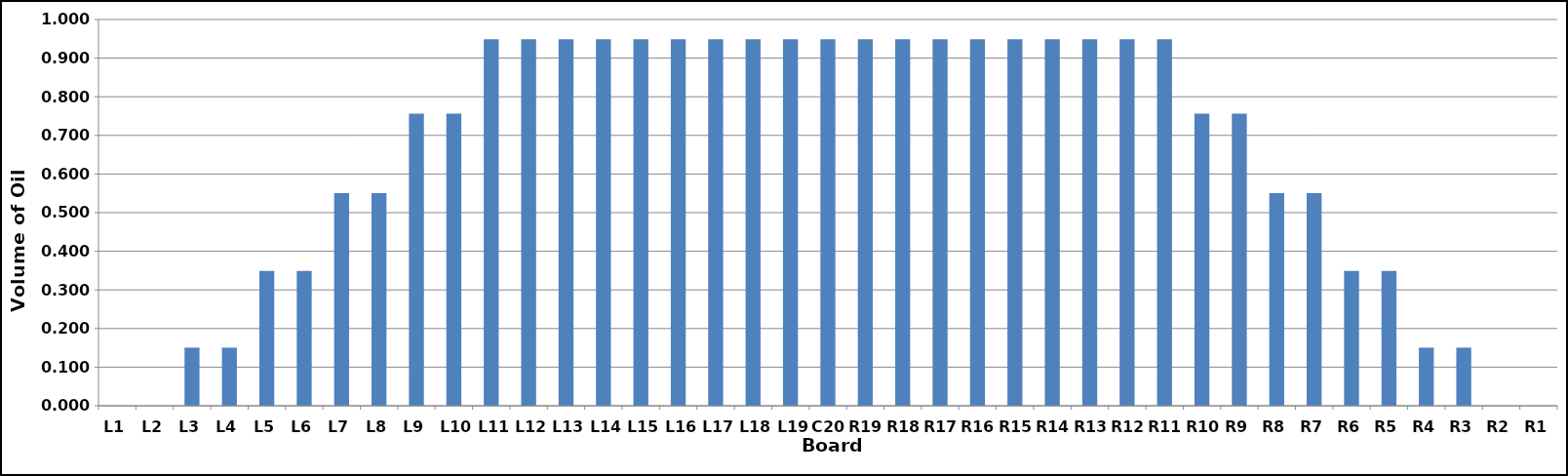
| Category | Series 0 |
|---|---|
| L1 | 0 |
| L2 | 0 |
| L3 | 0.15 |
| L4 | 0.15 |
| L5 | 0.349 |
| L6 | 0.349 |
| L7 | 0.55 |
| L8 | 0.55 |
| L9 | 0.757 |
| L10 | 0.757 |
| L11 | 0.949 |
| L12 | 0.949 |
| L13 | 0.949 |
| L14 | 0.949 |
| L15 | 0.949 |
| L16 | 0.949 |
| L17 | 0.949 |
| L18 | 0.949 |
| L19 | 0.949 |
| C20 | 0.949 |
| R19 | 0.949 |
| R18 | 0.949 |
| R17 | 0.949 |
| R16 | 0.949 |
| R15 | 0.949 |
| R14 | 0.949 |
| R13 | 0.949 |
| R12 | 0.949 |
| R11 | 0.949 |
| R10 | 0.757 |
| R9 | 0.757 |
| R8 | 0.55 |
| R7 | 0.55 |
| R6 | 0.349 |
| R5 | 0.349 |
| R4 | 0.15 |
| R3 | 0.15 |
| R2 | 0 |
| R1 | 0 |